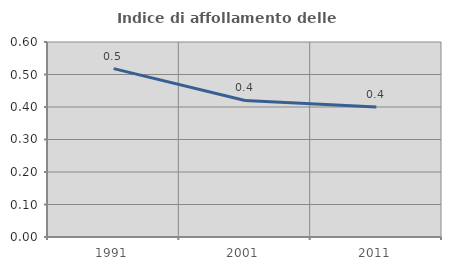
| Category | Indice di affollamento delle abitazioni  |
|---|---|
| 1991.0 | 0.518 |
| 2001.0 | 0.42 |
| 2011.0 | 0.4 |